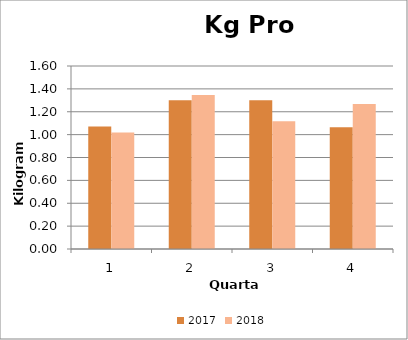
| Category | 2017 | 2018 |
|---|---|---|
| 0 | 1.071 | 1.018 |
| 1 | 1.301 | 1.347 |
| 2 | 1.301 | 1.117 |
| 3 | 1.064 | 1.268 |